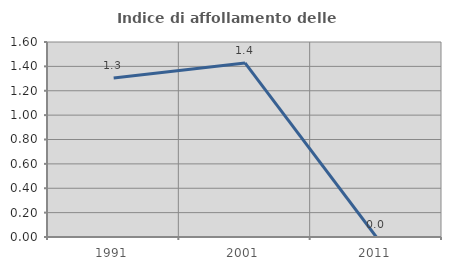
| Category | Indice di affollamento delle abitazioni  |
|---|---|
| 1991.0 | 1.304 |
| 2001.0 | 1.429 |
| 2011.0 | 0 |